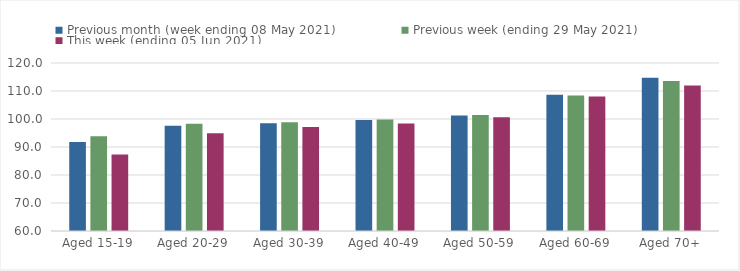
| Category | Previous month (week ending 08 May 2021) | Previous week (ending 29 May 2021) | This week (ending 05 Jun 2021) |
|---|---|---|---|
| Aged 15-19 | 91.83 | 93.88 | 87.32 |
| Aged 20-29 | 97.57 | 98.26 | 94.95 |
| Aged 30-39 | 98.52 | 98.87 | 97.11 |
| Aged 40-49 | 99.62 | 99.84 | 98.43 |
| Aged 50-59 | 101.24 | 101.46 | 100.65 |
| Aged 60-69 | 108.68 | 108.42 | 108.04 |
| Aged 70+ | 114.74 | 113.57 | 111.97 |